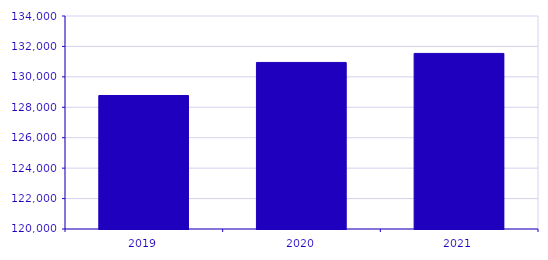
| Category | Utgifter för egen FoU |
|---|---|
| 2019.0 | 128774.807 |
| 2020.0 | 130947.113 |
| 2021.0 | 131541 |